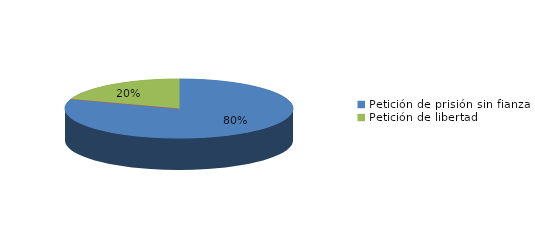
| Category | Series 0 |
|---|---|
| Petición de prisión sin fianza | 61 |
| Petición de prisión con fianza | 0 |
| Petición de libertad | 15 |